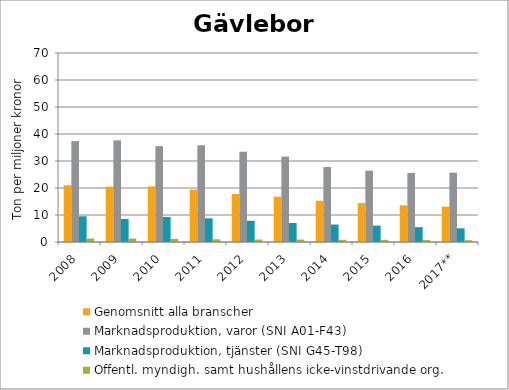
| Category | Genomsnitt alla branscher | Marknadsproduktion, varor (SNI A01-F43) | Marknadsproduktion, tjänster (SNI G45-T98) | Offentl. myndigh. samt hushållens icke-vinstdrivande org. |
|---|---|---|---|---|
| 2008 | 21.018 | 37.382 | 9.514 | 1.288 |
| 2009 | 20.495 | 37.654 | 8.538 | 1.298 |
| 2010 | 20.602 | 35.514 | 9.236 | 1.157 |
| 2011 | 19.447 | 35.879 | 8.777 | 1.022 |
| 2012 | 17.769 | 33.463 | 7.846 | 0.928 |
| 2013 | 16.776 | 31.638 | 7.034 | 0.901 |
| 2014 | 15.256 | 27.76 | 6.459 | 0.834 |
| 2015 | 14.395 | 26.4 | 6.07 | 0.797 |
| 2016 | 13.586 | 25.596 | 5.489 | 0.71 |
| 2017** | 13.111 | 25.679 | 5.062 | 0.66 |